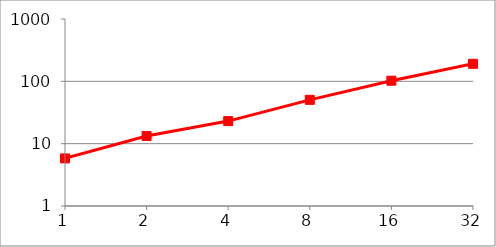
| Category | Series 0 |
|---|---|
| 1.0 | 5.801 |
| 2.0 | 13.252 |
| 4.0 | 23.025 |
| 8.0 | 50.484 |
| 16.0 | 102.304 |
| 32.0 | 190.953 |